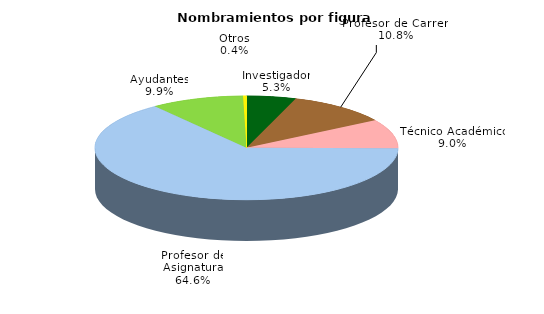
| Category | Series 0 |
|---|---|
| Investigador | 2645 |
| Profesor de Carrera | 5461 |
| Técnico Académico | 4537 |
| Profesor de Asignatura | 32556 |
| Ayudantes | 4985 |
| Otros | 185 |